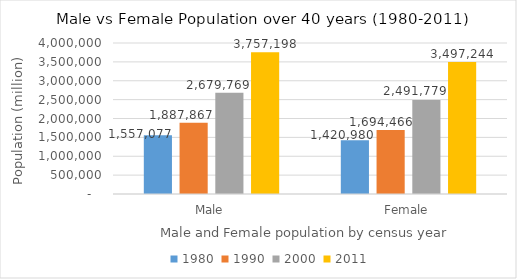
| Category | 1980 | 1990 | 2000 | 2011 |
|---|---|---|---|---|
| Male | 1557077 | 1887867 | 2679769 | 3757198 |
| Female | 1420980 | 1694466 | 2491779 | 3497244 |